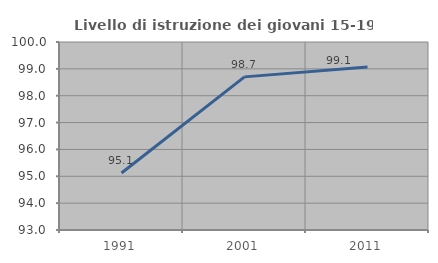
| Category | Livello di istruzione dei giovani 15-19 anni |
|---|---|
| 1991.0 | 95.122 |
| 2001.0 | 98.701 |
| 2011.0 | 99.065 |